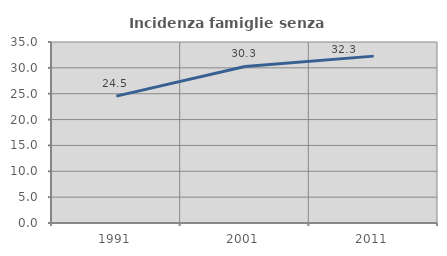
| Category | Incidenza famiglie senza nuclei |
|---|---|
| 1991.0 | 24.532 |
| 2001.0 | 30.277 |
| 2011.0 | 32.268 |